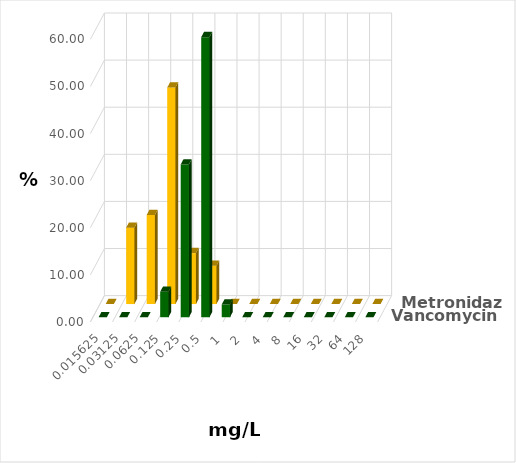
| Category | Vancomycin | Metronidazol |
|---|---|---|
| 0.015625 | 0 | 0 |
| 0.03125 | 0 | 16.216 |
| 0.0625 | 0 | 18.919 |
| 0.125 | 5.405 | 45.946 |
| 0.25 | 32.432 | 10.811 |
| 0.5 | 59.459 | 8.108 |
| 1.0 | 2.703 | 0 |
| 2.0 | 0 | 0 |
| 4.0 | 0 | 0 |
| 8.0 | 0 | 0 |
| 16.0 | 0 | 0 |
| 32.0 | 0 | 0 |
| 64.0 | 0 | 0 |
| 128.0 | 0 | 0 |